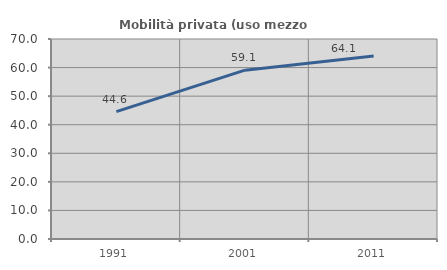
| Category | Mobilità privata (uso mezzo privato) |
|---|---|
| 1991.0 | 44.595 |
| 2001.0 | 59.1 |
| 2011.0 | 64.083 |